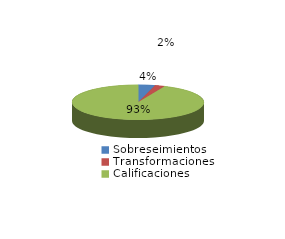
| Category | Series 0 |
|---|---|
| Sobreseimientos | 138 |
| Transformaciones | 81 |
| Calificaciones | 3148 |